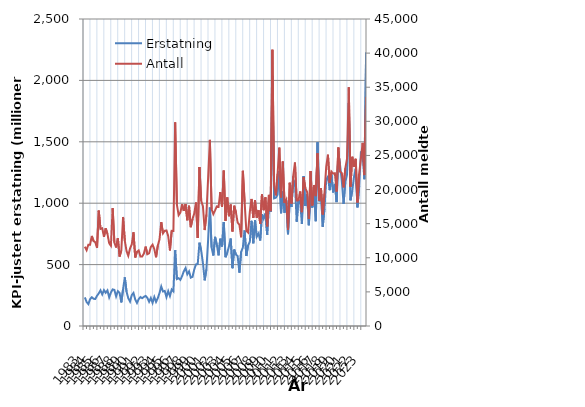
| Category | Erstatning |
|---|---|
| 1983.0 | 232.937 |
| nan | 195.121 |
| nan | 178.438 |
| nan | 218.579 |
| 1984.0 | 234.389 |
| nan | 221.715 |
| nan | 219.826 |
| nan | 245.877 |
| 1985.0 | 265.702 |
| nan | 290.42 |
| nan | 257.346 |
| nan | 291.865 |
| 1986.0 | 270.604 |
| nan | 289.558 |
| nan | 233.055 |
| nan | 272.728 |
| 1987.0 | 297.95 |
| nan | 294.021 |
| nan | 240.61 |
| nan | 283.085 |
| 1988.0 | 269.44 |
| nan | 192.069 |
| nan | 299.153 |
| nan | 396.293 |
| 1989.0 | 279.972 |
| nan | 226.285 |
| nan | 199.112 |
| nan | 251.201 |
| 1990.0 | 268.971 |
| nan | 216.388 |
| nan | 187.666 |
| nan | 218.436 |
| 1991.0 | 235.713 |
| nan | 226.637 |
| nan | 237.191 |
| nan | 245.226 |
| 1992.0 | 229.086 |
| nan | 197.393 |
| nan | 228.083 |
| nan | 188.213 |
| 1993.0 | 236.156 |
| nan | 196.535 |
| nan | 227.061 |
| nan | 268.62 |
| 1994.0 | 321.731 |
| nan | 281.266 |
| nan | 285.763 |
| nan | 235.54 |
| 1995.0 | 283.776 |
| nan | 244.132 |
| nan | 296.645 |
| nan | 281.65 |
| 1996.0 | 617.657 |
| nan | 382.464 |
| nan | 389.296 |
| nan | 375.446 |
| 1997.0 | 406.453 |
| nan | 446.013 |
| nan | 472.333 |
| nan | 421.43 |
| 1998.0 | 444.599 |
| nan | 393.872 |
| nan | 400.307 |
| nan | 460.108 |
| 1999.0 | 501.845 |
| nan | 504.283 |
| nan | 678.577 |
| nan | 614.541 |
| 2000.0 | 512.261 |
| nan | 372.014 |
| nan | 461.192 |
| nan | 703.176 |
| 2001.0 | 965.028 |
| nan | 638.852 |
| nan | 573.774 |
| nan | 725.942 |
| 2002.0 | 661.156 |
| nan | 575.27 |
| nan | 710.935 |
| nan | 647.82 |
| 2003.0 | 847.26 |
| nan | 560.178 |
| nan | 595.958 |
| nan | 649.208 |
| 2004.0 | 712.217 |
| nan | 470.87 |
| nan | 622.509 |
| nan | 581.854 |
| 2005.0 | 569.493 |
| nan | 434.602 |
| nan | 603.345 |
| nan | 639.394 |
| 2006.0 | 777.195 |
| nan | 569.965 |
| nan | 655.815 |
| nan | 684.196 |
| 2007.0 | 856.408 |
| nan | 673.317 |
| nan | 860.276 |
| nan | 727.347 |
| 2008.0 | 752.172 |
| nan | 696.322 |
| nan | 909.437 |
| nan | 873.42 |
| 2009.0 | 916.557 |
| nan | 744.098 |
| nan | 982.934 |
| nan | 929.078 |
| 2010.0 | 2038.021 |
| nan | 1039.492 |
| nan | 1044.493 |
| nan | 1068.56 |
| 2011.0 | 1262.842 |
| nan | 918.31 |
| nan | 1094.943 |
| nan | 922.779 |
| 2012.0 | 1022.313 |
| nan | 747.404 |
| nan | 1030.461 |
| nan | 970.277 |
| 2013.0 | 1191.601 |
| nan | 1166.802 |
| nan | 849.019 |
| nan | 1025.516 |
| 2014.0 | 1011.435 |
| nan | 830.588 |
| nan | 1221.838 |
| nan | 976.933 |
| 2015.0 | 1071.822 |
| nan | 820.828 |
| nan | 1086.542 |
| nan | 964.725 |
| 2016.0 | 1109.027 |
| nan | 853.659 |
| nan | 1497.167 |
| nan | 1015.828 |
| 2017.0 | 1088.954 |
| nan | 807.65 |
| nan | 953.843 |
| nan | 1191.034 |
| 2018.0 | 1215.874 |
| nan | 1106.121 |
| nan | 1232.942 |
| nan | 1087.816 |
| 2019.0 | 1157.146 |
| nan | 1008.947 |
| nan | 1404.229 |
| nan | 1307.73 |
| 2020.0 | 1182.332 |
| nan | 993.156 |
| nan | 1171.889 |
| nan | 1232.253 |
| 2021.0 | 1816.342 |
| nan | 1023.29 |
| nan | 1100.926 |
| nan | 1213.6 |
| 2022.0 | 1280.476 |
| nan | 966.126 |
| nan | 1138.392 |
| nan | 1421.118 |
| 2023.0 | 1384.154 |
| nan | 1195.57 |
| nan | 2227.739 |